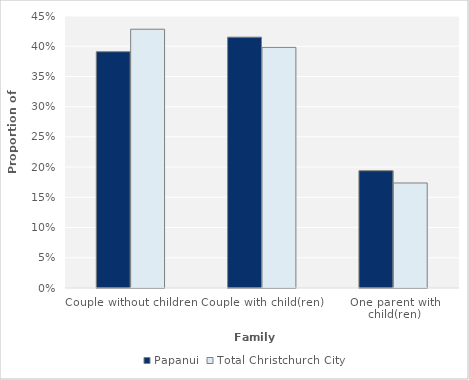
| Category | Papanui | Total Christchurch City |
|---|---|---|
| Couple without children | 0.391 | 0.428 |
| Couple with child(ren) | 0.415 | 0.398 |
| One parent with child(ren) | 0.194 | 0.174 |